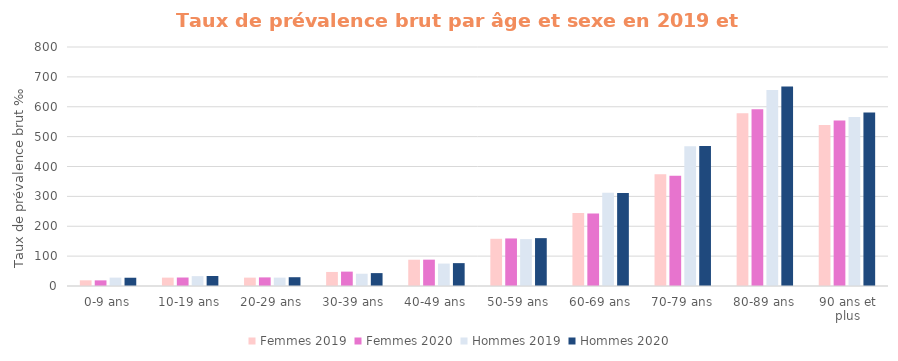
| Category | Femmes 2019 | Femmes 2020 | Hommes 2019 | Hommes 2020 |
|---|---|---|---|---|
| 0-9 ans | 19 | 18.85 | 28 | 27.667 |
| 10-19 ans | 28 | 28.396 | 33 | 33.478 |
| 20-29 ans | 28 | 28.804 | 28 | 29.409 |
| 30-39 ans | 47 | 48.102 | 41 | 43.154 |
| 40-49 ans | 88 | 88.165 | 75 | 76.542 |
| 50-59 ans | 158 | 159.148 | 157 | 160.206 |
| 60-69 ans | 244 | 242.809 | 312 | 311.424 |
| 70-79 ans | 374 | 368.733 | 468 | 468.926 |
| 80-89 ans | 578 | 591.498 | 656 | 668.104 |
| 90 ans et plus | 539 | 554.166 | 566 | 581.118 |